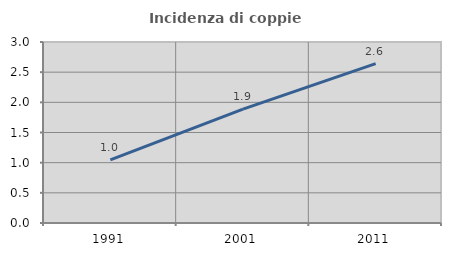
| Category | Incidenza di coppie miste |
|---|---|
| 1991.0 | 1.047 |
| 2001.0 | 1.887 |
| 2011.0 | 2.643 |